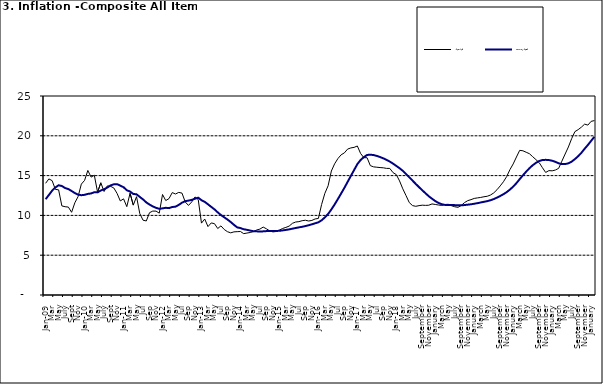
| Category | Year-on Rate | 12-Month Average |
|---|---|---|
| Jan-09 | 14.034 | 12.032 |
| Feb | 14.584 | 12.567 |
| Mar | 14.366 | 13.101 |
| Apr | 13.268 | 13.51 |
| May | 13.212 | 13.787 |
| June | 11.194 | 13.694 |
| July | 11.09 | 13.437 |
| Aug | 11.046 | 13.307 |
| Sept | 10.39 | 13.065 |
| Oct | 11.588 | 12.803 |
| Nov | 12.368 | 12.609 |
| Dec | 13.93 | 12.538 |
| Jan-10 | 14.398 | 12.586 |
| Feb | 15.649 | 12.7 |
| Mar | 14.812 | 12.757 |
| Apr | 15.044 | 12.915 |
| May | 12.915 | 12.893 |
| June | 14.099 | 13.132 |
| July | 13.002 | 13.284 |
| Aug | 13.702 | 13.5 |
| Sept | 13.65 | 13.764 |
| Oct | 13.45 | 13.908 |
| Nov | 12.766 | 13.928 |
| Dec | 11.815 | 13.74 |
| Jan-11 | 12.08 | 13.542 |
| Feb | 11.1 | 13.161 |
| Mar | 12.779 | 13.001 |
| Apr | 11.291 | 12.694 |
| May | 12.352 | 12.648 |
| Jun | 10.23 | 12.321 |
| Jul | 9.397 | 12.009 |
| Aug | 9.301 | 11.635 |
| Sep | 10.339 | 11.363 |
| Oct | 10.544 | 11.13 |
| Nov | 10.54 | 10.952 |
| Dec | 10.283 | 10.826 |
| Jan-12 | 12.626 | 10.886 |
| Feb | 11.866 | 10.955 |
| Mar | 12.111 | 10.914 |
| Apr | 12.866 | 11.054 |
| May | 12.688 | 11.096 |
| Jun | 12.892 | 11.32 |
| Jul | 12.797 | 11.599 |
| Aug | 11.689 | 11.791 |
| Sep | 11.253 | 11.859 |
| Oct | 11.693 | 11.948 |
| Nov | 12.32 | 12.091 |
| Dec | 11.981 | 12.224 |
| Jan-13 | 9.031 | 11.908 |
| Feb | 9.542 | 11.703 |
| Mar | 8.593 | 11.394 |
| Apr | 9.052 | 11.072 |
| May | 8.964 | 10.761 |
| Jun | 8.353 | 10.383 |
| Jul | 8.682 | 10.047 |
| Aug | 8.231 | 9.761 |
| Sep | 7.952 | 9.486 |
| Oct | 7.807 | 9.167 |
| Nov | 7.931 | 8.815 |
| Dec | 7.957 | 8.496 |
| Jan-14 | 7.977 | 8.408 |
| Feb | 7.707 | 8.257 |
| Mar | 7.783 | 8.19 |
| Apr | 7.851 | 8.092 |
| May | 7.965 | 8.012 |
| Jun | 8.167 | 7.998 |
| Jul | 8.281 | 7.968 |
| Aug | 8.534 | 7.996 |
| Sep | 8.317 | 8.027 |
| Oct | 8.06 | 8.047 |
| Nov | 7.927 | 8.046 |
| Dec | 7.978 | 8.047 |
| Jan-15 | 8.157 | 8.063 |
| Feb | 8.359 | 8.117 |
| Mar | 8.494 | 8.176 |
| Apr | 8.655 | 8.243 |
| May | 9.003 | 8.331 |
| Jun | 9.168 | 8.417 |
| Jul | 9.218 | 8.497 |
| Aug | 9.336 | 8.566 |
| Sep | 9.394 | 8.658 |
| Oct | 9.296 | 8.76 |
| Nov | 9.368 | 8.879 |
| Dec | 9.554 | 9.009 |
| Jan-16 | 9.617 | 9.13 |
| Feb | 11.379 | 9.386 |
| Mar | 12.775 | 9.751 |
| Apr | 13.721 | 10.182 |
| May | 15.577 | 10.746 |
| Jun | 16.48 | 11.372 |
| Jul | 17.127 | 12.045 |
| Aug | 17.609 | 12.744 |
| Sep | 17.852 | 13.454 |
| Oct | 18.33 | 14.206 |
| Nov | 18.476 | 14.958 |
| Dec | 18.547 | 15.697 |
| Jan-17 | 18.719 | 16.441 |
| Feb | 17.78 | 16.958 |
| Mar | 17.256 | 17.315 |
| Apr | 17.244 | 17.591 |
| May | 16.251 | 17.628 |
| Jun | 16.098 | 17.578 |
| Jul | 16.053 | 17.475 |
| Aug | 16.012 | 17.331 |
| Sep | 15.979 | 17.17 |
| Oct | 15.905 | 16.968 |
| Nov | 15.901 | 16.76 |
| Dec | 15.372 | 16.502 |
| Jan-18 | 15.127 | 16.215 |
| Feb | 14.33 | 15.93 |
| Mar | 13.337 | 15.599 |
| Apr | 12.482 | 15.196 |
| May | 11.608 | 14.793 |
| June | 11.231 | 14.371 |
| July | 11.142 | 13.95 |
| August | 11.227 | 13.546 |
| September | 11.284 | 13.157 |
| October | 11.259 | 12.777 |
| November | 11.281 | 12.406 |
| December | 11.442 | 12.095 |
| January | 11.374 | 11.801 |
| February | 11.306 | 11.564 |
| March | 11.251 | 11.401 |
| April | 11.372 | 11.314 |
| May | 11.396 | 11.299 |
| June | 11.217 | 11.297 |
| July | 11.084 | 11.291 |
| August | 11.016 | 11.271 |
| September | 11.244 | 11.268 |
| October | 11.607 | 11.298 |
| November | 11.854 | 11.348 |
| December | 11.982 | 11.396 |
| January | 12.132 | 11.462 |
| February | 12.199 | 11.539 |
| March | 12.257 | 11.624 |
| April | 12.341 | 11.706 |
| May | 12.404 | 11.791 |
| June | 12.559 | 11.904 |
| July | 12.821 | 12.049 |
| August | 13.22 | 12.233 |
| September | 13.707 | 12.44 |
| October | 14.233 | 12.664 |
| November | 14.887 | 12.923 |
| December | 15.753 | 13.246 |
| January | 16.466 | 13.616 |
| February | 17.335 | 14.053 |
| March | 18.171 | 14.554 |
| April | 18.117 | 15.039 |
| May | 17.933 | 15.499 |
| June | 17.751 | 15.927 |
| July | 17.377 | 16.298 |
| August | 17.009 | 16.601 |
| September | 16.63 | 16.83 |
| October | 15.994 | 16.958 |
| November | 15.396 | 16.979 |
| December | 15.625 | 16.953 |
| January | 15.601 | 16.869 |
| February | 15.702 | 16.728 |
| March | 15.915 | 16.544 |
| April | 16.819 | 16.449 |
| May | 17.712 | 16.449 |
| June | 18.596 | 16.542 |
| July | 19.643 | 16.755 |
| August | 20.525 | 17.07 |
| September | 20.774 | 17.432 |
| October | 21.087 | 17.865 |
| November | 21.466 | 18.372 |
| December | 21.344 | 18.847 |
| January | 21.816 | 19.362 |
| February | 21.91 | 19.873 |